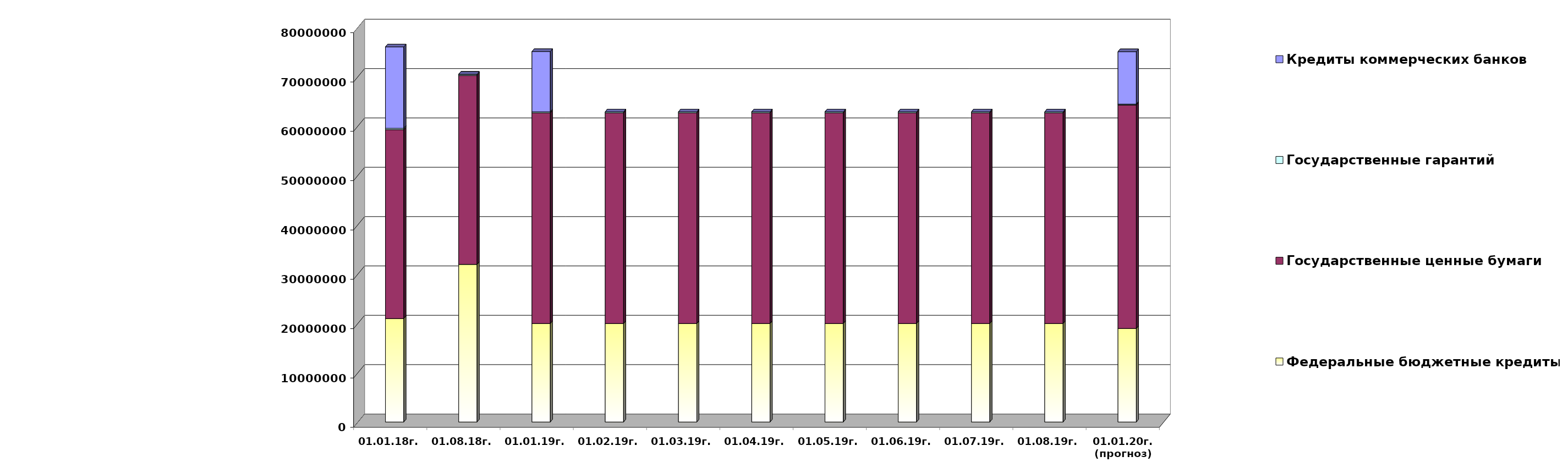
| Category | Федеральные бюджетные кредиты | Государственные ценные бумаги  | Государственные гарантий | Кредиты коммерческих банков |
|---|---|---|---|---|
| 01.01.18г. | 20959084.963 | 38300000 | 267412.82 | 16500000 |
| 01.08.18г. | 31945227.963 | 38300000 | 232477.01 | 0 |
| 01.01.19г. | 19957026.213 | 42700000 | 209872.86 | 12219963.75 |
| 01.02.19г. | 19957026.213 | 42700000 | 200735.86 | 0 |
| 01.03.19г. | 19957026.213 | 42700000 | 200735.86 | 0 |
| 01.04.19г. | 19957026.213 | 42700000 | 200735.86 | 0 |
| 01.05.19г. | 19957026.213 | 42700000 | 200735.86 | 0 |
| 01.06.19г. | 19957026.213 | 42700000 | 200735.86 | 0 |
| 01.07.19г. | 19957026.213 | 42700000 | 200735.86 | 0 |
| 01.08.19г. | 19957026.213 | 42700000 | 187793.375 | 0 |
| 01.01.20г.
(прогноз) | 18954967.4 | 45300000 | 176330 | 10629335.9 |